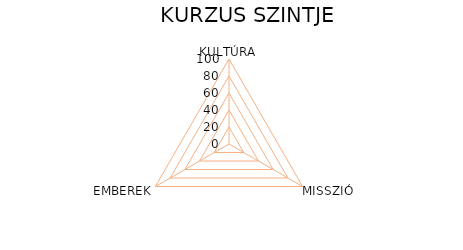
| Category | Series 0 |
|---|---|
| KULTÚRA | 0 |
| MISSZIÓ | 0 |
| EMBEREK | 0 |